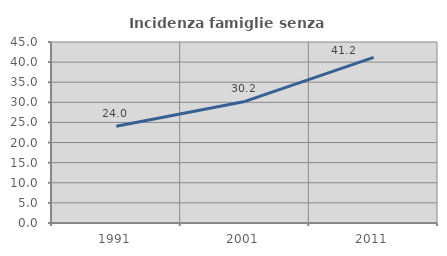
| Category | Incidenza famiglie senza nuclei |
|---|---|
| 1991.0 | 24.031 |
| 2001.0 | 30.22 |
| 2011.0 | 41.192 |